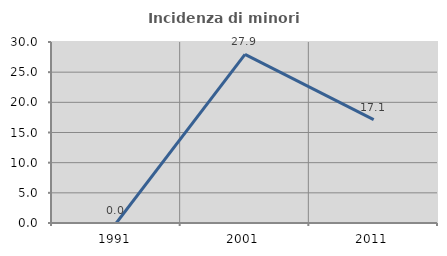
| Category | Incidenza di minori stranieri |
|---|---|
| 1991.0 | 0 |
| 2001.0 | 27.941 |
| 2011.0 | 17.143 |